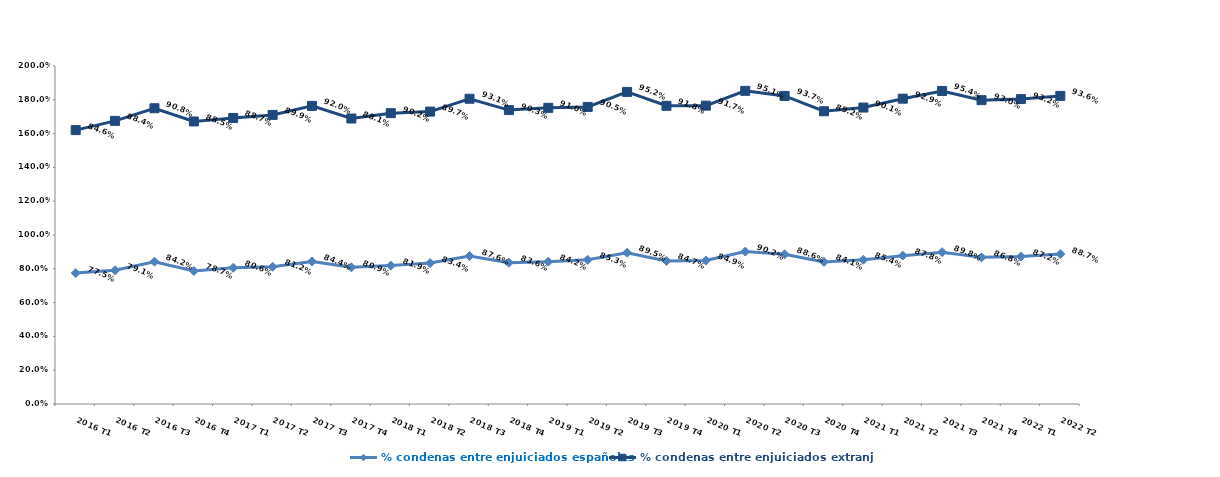
| Category | % condenas entre enjuiciados españoles | % condenas entre enjuiciados extranjeros |
|---|---|---|
| 2016 T1 | 0.775 | 0.846 |
| 2016 T2 | 0.791 | 0.884 |
| 2016 T3 | 0.842 | 0.908 |
| 2016 T4 | 0.787 | 0.885 |
| 2017 T1 | 0.806 | 0.887 |
| 2017 T2 | 0.812 | 0.899 |
| 2017 T3 | 0.844 | 0.92 |
| 2017 T4 | 0.809 | 0.881 |
| 2018 T1 | 0.819 | 0.902 |
| 2018 T2 | 0.834 | 0.897 |
| 2018 T3 | 0.876 | 0.931 |
| 2018 T4 | 0.836 | 0.903 |
| 2019 T1 | 0.842 | 0.91 |
| 2019 T2 | 0.853 | 0.905 |
| 2019 T3 | 0.895 | 0.952 |
| 2019 T4 | 0.847 | 0.918 |
| 2020 T1 | 0.849 | 0.917 |
| 2020 T2 | 0.902 | 0.951 |
| 2020 T3 | 0.886 | 0.937 |
| 2020 T4 | 0.841 | 0.892 |
| 2021 T1 | 0.854 | 0.901 |
| 2021 T2 | 0.878 | 0.929 |
| 2021 T3 | 0.898 | 0.954 |
| 2021 T4 | 0.868 | 0.93 |
| 2022 T1 | 0.872 | 0.932 |
| 2022 T2 | 0.887 | 0.936 |